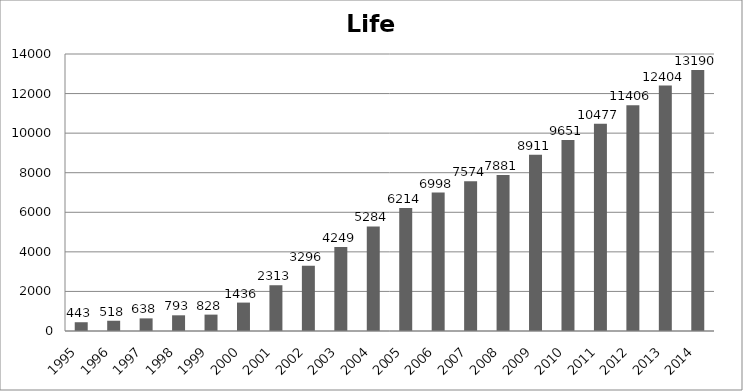
| Category | Series 0 |
|---|---|
| 1995.0 | 443 |
| 1996.0 | 518 |
| 1997.0 | 638 |
| 1998.0 | 793 |
| 1999.0 | 828 |
| 2000.0 | 1436 |
| 2001.0 | 2313 |
| 2002.0 | 3296 |
| 2003.0 | 4249 |
| 2004.0 | 5284 |
| 2005.0 | 6214 |
| 2006.0 | 6998 |
| 2007.0 | 7574 |
| 2008.0 | 7881 |
| 2009.0 | 8911 |
| 2010.0 | 9651 |
| 2011.0 | 10477 |
| 2012.0 | 11406 |
| 2013.0 | 12404 |
| 2014.0 | 13190 |